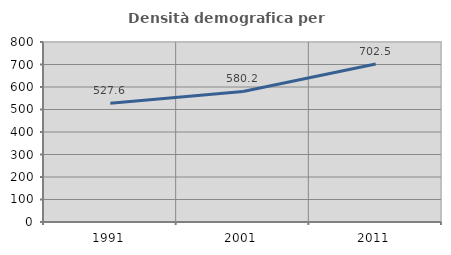
| Category | Densità demografica |
|---|---|
| 1991.0 | 527.636 |
| 2001.0 | 580.16 |
| 2011.0 | 702.549 |